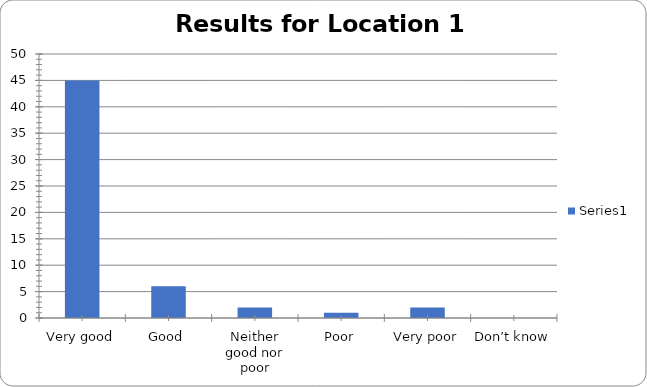
| Category | Series 0 |
|---|---|
| Very good | 45 |
| Good | 6 |
| Neither good nor poor | 2 |
| Poor | 1 |
| Very poor | 2 |
| Don’t know | 0 |